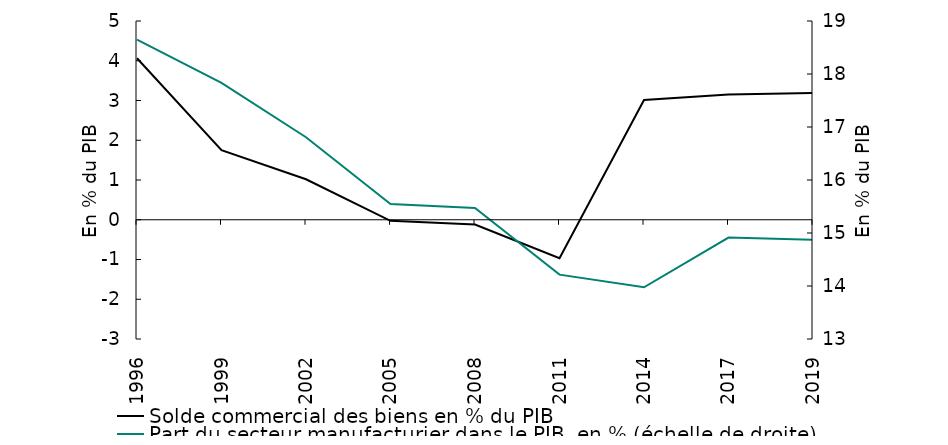
| Category | Solde commercial des biens en % du PIB |
|---|---|
| 1996.0 | 4.064 |
| 1999.0 | 1.75 |
| 2002.0 | 1.018 |
| 2005.0 | -0.028 |
| 2008.0 | -0.121 |
| 2011.0 | -0.968 |
| 2014.0 | 3.012 |
| 2017.0 | 3.15 |
| 2019.0 | 3.192 |